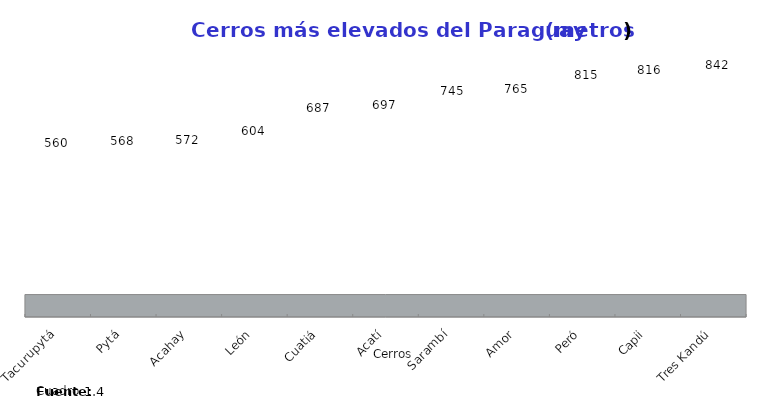
| Category | Altura (m) |
|---|---|
| Tacurupytá | 560 |
| Pytá | 568 |
| Acahay | 572 |
| León | 604 |
| Cuatiá | 687 |
| Acatí | 697 |
| Sarambí | 745 |
| Amor | 765 |
| Peró | 815 |
| Capii | 816 |
| Tres Kandú | 842 |